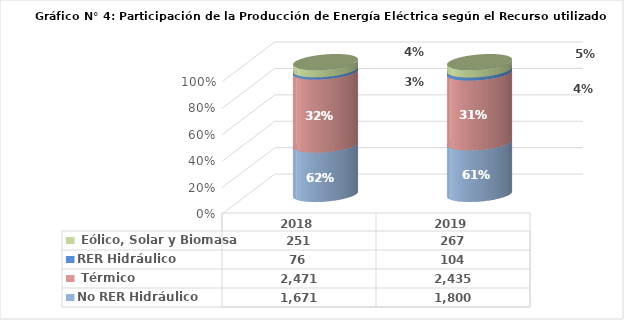
| Category | No RER | RER |
|---|---|---|
| 2018.0 | 2470.74 | 251.426 |
| 2019.0 | 2435.456 | 267.416 |